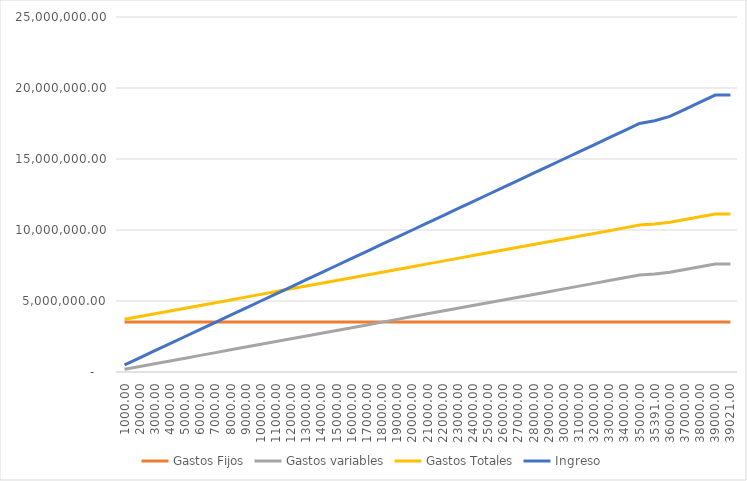
| Category | Gastos Fijos | Gastos variables | Gastos Totales | Ingreso |
|---|---|---|---|---|
| 1000.0 | 3516506.264 | 195074.171 | 3711580.435 | 500000 |
| 2000.0 | 3516506.264 | 390148.342 | 3906654.606 | 1000000 |
| 3000.0 | 3516506.264 | 585222.513 | 4101728.777 | 1500000 |
| 4000.0 | 3516506.264 | 780296.685 | 4296802.949 | 2000000 |
| 5000.0 | 3516506.264 | 975370.856 | 4491877.12 | 2500000 |
| 6000.0 | 3516506.264 | 1170445.027 | 4686951.291 | 3000000 |
| 7000.0 | 3516506.264 | 1365519.198 | 4882025.462 | 3500000 |
| 8000.0 | 3516506.264 | 1560593.369 | 5077099.633 | 4000000 |
| 9000.0 | 3516506.264 | 1755667.54 | 5272173.804 | 4500000 |
| 10000.0 | 3516506.264 | 1950741.711 | 5467247.975 | 5000000 |
| 11000.0 | 3516506.264 | 2145815.883 | 5662322.147 | 5500000 |
| 12000.0 | 3516506.264 | 2340890.054 | 5857396.318 | 6000000 |
| 13000.0 | 3516506.264 | 2535964.225 | 6052470.489 | 6500000 |
| 14000.0 | 3516506.264 | 2731038.396 | 6247544.66 | 7000000 |
| 15000.0 | 3516506.264 | 2926112.567 | 6442618.831 | 7500000 |
| 16000.0 | 3516506.264 | 3121186.738 | 6637693.002 | 8000000 |
| 17000.0 | 3516506.264 | 3316260.909 | 6832767.173 | 8500000 |
| 18000.0 | 3516506.264 | 3511335.08 | 7027841.345 | 9000000 |
| 19000.0 | 3516506.264 | 3706409.252 | 7222915.516 | 9500000 |
| 20000.0 | 3516506.264 | 3901483.423 | 7417989.687 | 10000000 |
| 21000.0 | 3516506.264 | 4096557.594 | 7613063.858 | 10500000 |
| 22000.0 | 3516506.264 | 4291631.765 | 7808138.029 | 11000000 |
| 23000.0 | 3516506.264 | 4486705.936 | 8003212.2 | 11500000 |
| 24000.0 | 3516506.264 | 4681780.107 | 8198286.371 | 12000000 |
| 25000.0 | 3516506.264 | 4876854.278 | 8393360.542 | 12500000 |
| 26000.0 | 3516506.264 | 5071928.45 | 8588434.714 | 13000000 |
| 27000.0 | 3516506.264 | 5267002.621 | 8783508.885 | 13500000 |
| 28000.0 | 3516506.264 | 5462076.792 | 8978583.056 | 14000000 |
| 29000.0 | 3516506.264 | 5657150.963 | 9173657.227 | 14500000 |
| 30000.0 | 3516506.264 | 5852225.134 | 9368731.398 | 15000000 |
| 31000.0 | 3516506.264 | 6047299.305 | 9563805.569 | 15500000 |
| 32000.0 | 3516506.264 | 6242373.476 | 9758879.74 | 16000000 |
| 33000.0 | 3516506.264 | 6437447.648 | 9953953.912 | 16500000 |
| 34000.0 | 3516506.264 | 6632521.819 | 10149028.083 | 17000000 |
| 35000.0 | 3516506.264 | 6827595.99 | 10344102.254 | 17500000 |
| 35391.0 | 3516506.264 | 6903869.991 | 10420376.255 | 17695500 |
| 36000.0 | 3516506.264 | 7022670.161 | 10539176.425 | 18000000 |
| 37000.0 | 3516506.264 | 7217744.332 | 10734250.596 | 18500000 |
| 38000.0 | 3516506.264 | 7412818.503 | 10929324.767 | 19000000 |
| 39000.0 | 3516506.264 | 7607892.674 | 11124398.938 | 19500000 |
| 39021.0 | 3516506.264 | 7611989.232 | 11128495.496 | 19510500 |